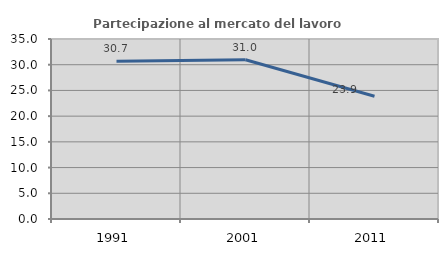
| Category | Partecipazione al mercato del lavoro  femminile |
|---|---|
| 1991.0 | 30.653 |
| 2001.0 | 30.964 |
| 2011.0 | 23.856 |